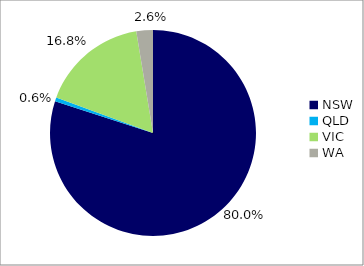
| Category | Series 0 |
|---|---|
| NSW | 0.8 |
| QLD | 0.006 |
| VIC | 0.168 |
| WA | 0.026 |